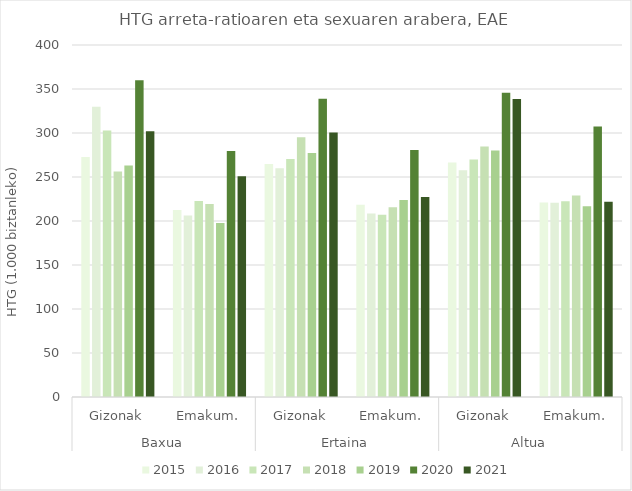
| Category | 2015 | 2016 | 2017 | 2018 | 2019 | 2020 | 2021 |
|---|---|---|---|---|---|---|---|
| 0 | 272.835 | 329.72 | 302.964 | 256.198 | 263.183 | 359.979 | 302.022 |
| 1 | 212.536 | 206.17 | 222.7 | 219.235 | 197.839 | 279.511 | 250.935 |
| 2 | 264.889 | 259.916 | 270.314 | 295.057 | 277.339 | 339.023 | 300.606 |
| 3 | 218.352 | 208.41 | 207.017 | 215.514 | 223.821 | 280.554 | 227.198 |
| 4 | 266.363 | 257.653 | 270.003 | 284.685 | 280.216 | 345.767 | 338.58 |
| 5 | 220.926 | 220.722 | 222.553 | 228.846 | 216.749 | 307.306 | 221.792 |